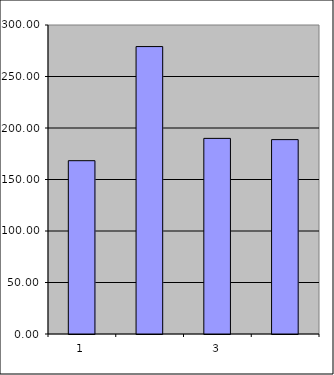
| Category | Series 0 |
|---|---|
| 0 | 168.25 |
| 1 | 279.063 |
| 2 | 189.918 |
| 3 | 188.725 |